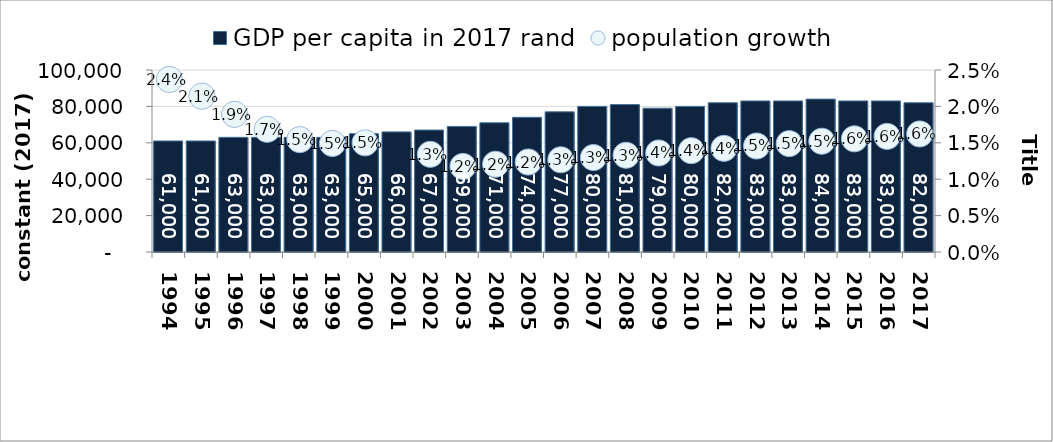
| Category | GDP per capita in 2017 rand |
|---|---|
| 1994.0 | 61000 |
| 1995.0 | 61000 |
| 1996.0 | 63000 |
| 1997.0 | 63000 |
| 1998.0 | 63000 |
| 1999.0 | 63000 |
| 2000.0 | 65000 |
| 2001.0 | 66000 |
| 2002.0 | 67000 |
| 2003.0 | 69000 |
| 2004.0 | 71000 |
| 2005.0 | 74000 |
| 2006.0 | 77000 |
| 2007.0 | 80000 |
| 2008.0 | 81000 |
| 2009.0 | 79000 |
| 2010.0 | 80000 |
| 2011.0 | 82000 |
| 2012.0 | 83000 |
| 2013.0 | 83000 |
| 2014.0 | 84000 |
| 2015.0 | 83000 |
| 2016.0 | 83000 |
| 2017.0 | 82000 |